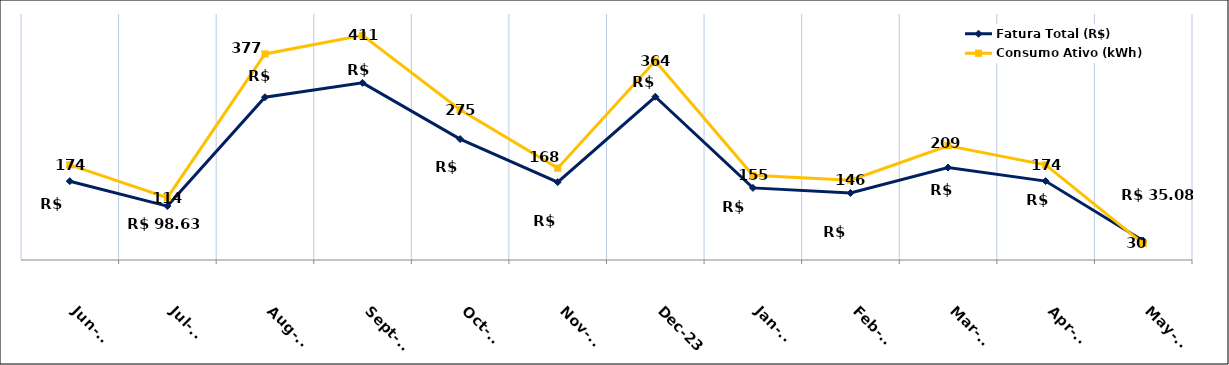
| Category | Fatura Total (R$) | Consumo Ativo (kWh) |
|---|---|---|
| 2023-06-01 | 144.19 | 174 |
| 2023-07-01 | 98.63 | 114 |
| 2023-08-01 | 297.76 | 377 |
| 2023-09-01 | 324.06 | 411 |
| 2023-10-01 | 221.12 | 275 |
| 2023-11-01 | 142.44 | 168 |
| 2023-12-01 | 298.6 | 364 |
| 2024-01-01 | 131.93 | 155 |
| 2024-02-01 | 122.49 | 146 |
| 2024-03-01 | 169.19 | 209 |
| 2024-04-01 | 144.35 | 174 |
| 2024-05-01 | 35.08 | 30 |